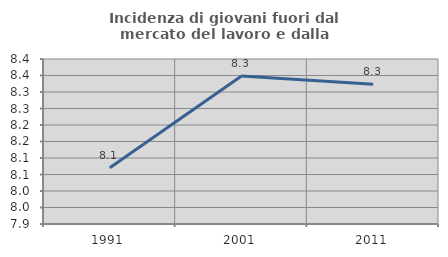
| Category | Incidenza di giovani fuori dal mercato del lavoro e dalla formazione  |
|---|---|
| 1991.0 | 8.07 |
| 2001.0 | 8.349 |
| 2011.0 | 8.323 |